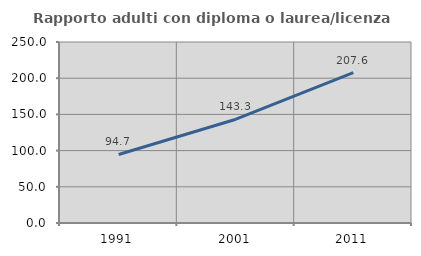
| Category | Rapporto adulti con diploma o laurea/licenza media  |
|---|---|
| 1991.0 | 94.676 |
| 2001.0 | 143.349 |
| 2011.0 | 207.605 |